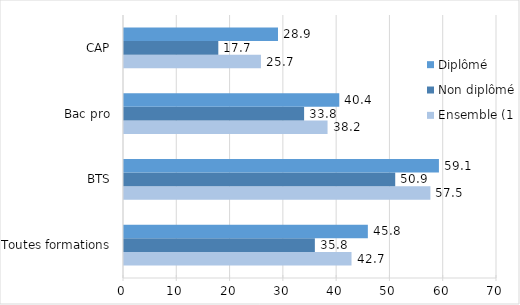
| Category | Ensemble (1) | Non diplômé | Diplômé |
|---|---|---|---|
| Toutes formations | 42.7 | 35.817 | 45.763 |
| BTS | 57.5 | 50.9 | 59.1 |
| Bac pro | 38.2 | 33.8 | 40.4 |
| CAP | 25.7 | 17.7 | 28.9 |